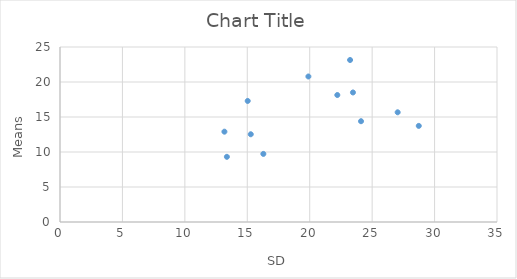
| Category | Series 0 |
|---|---|
| 23.463703148423896 | 18.505 |
| 19.893474877869966 | 20.787 |
| 28.73502895911022 | 13.729 |
| 24.10992359762036 | 14.397 |
| 13.168630348104005 | 12.904 |
| 23.23295102888709 | 23.143 |
| 15.03396454656962 | 17.292 |
| 16.286259917681864 | 9.728 |
| 27.04433551913143 | 15.673 |
| 22.21132806487677 | 18.14 |
| 13.366028832802927 | 9.31 |
| 15.27827921709051 | 12.534 |